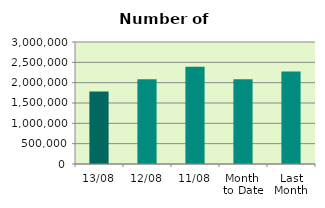
| Category | Series 0 |
|---|---|
| 13/08 | 1782762 |
| 12/08 | 2081224 |
| 11/08 | 2392012 |
| Month 
to Date | 2086610.444 |
| Last
Month | 2275631.565 |